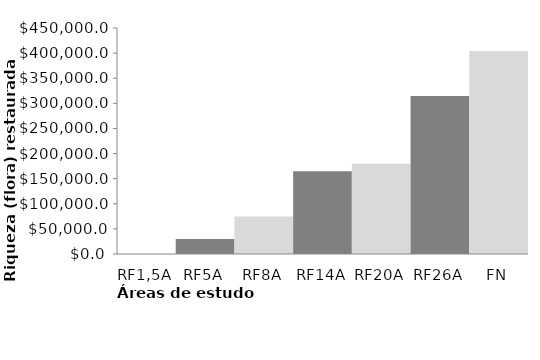
| Category | Series 0 |
|---|---|
| RF1,5A | 0 |
| RF5A | 29939.394 |
| RF8A | 74848.485 |
| RF14A | 164666.667 |
| RF20A | 179636.364 |
| RF26A | 314363.636 |
| FN | 404181.818 |